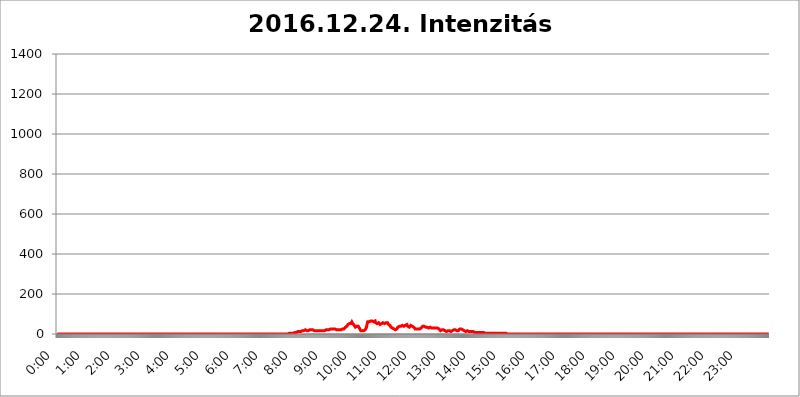
| Category | 2016.12.24. Intenzitás [W/m^2] |
|---|---|
| 0.0 | 0 |
| 0.0006944444444444445 | 0 |
| 0.001388888888888889 | 0 |
| 0.0020833333333333333 | 0 |
| 0.002777777777777778 | 0 |
| 0.003472222222222222 | 0 |
| 0.004166666666666667 | 0 |
| 0.004861111111111111 | 0 |
| 0.005555555555555556 | 0 |
| 0.0062499999999999995 | 0 |
| 0.006944444444444444 | 0 |
| 0.007638888888888889 | 0 |
| 0.008333333333333333 | 0 |
| 0.009027777777777779 | 0 |
| 0.009722222222222222 | 0 |
| 0.010416666666666666 | 0 |
| 0.011111111111111112 | 0 |
| 0.011805555555555555 | 0 |
| 0.012499999999999999 | 0 |
| 0.013194444444444444 | 0 |
| 0.013888888888888888 | 0 |
| 0.014583333333333332 | 0 |
| 0.015277777777777777 | 0 |
| 0.015972222222222224 | 0 |
| 0.016666666666666666 | 0 |
| 0.017361111111111112 | 0 |
| 0.018055555555555557 | 0 |
| 0.01875 | 0 |
| 0.019444444444444445 | 0 |
| 0.02013888888888889 | 0 |
| 0.020833333333333332 | 0 |
| 0.02152777777777778 | 0 |
| 0.022222222222222223 | 0 |
| 0.02291666666666667 | 0 |
| 0.02361111111111111 | 0 |
| 0.024305555555555556 | 0 |
| 0.024999999999999998 | 0 |
| 0.025694444444444447 | 0 |
| 0.02638888888888889 | 0 |
| 0.027083333333333334 | 0 |
| 0.027777777777777776 | 0 |
| 0.02847222222222222 | 0 |
| 0.029166666666666664 | 0 |
| 0.029861111111111113 | 0 |
| 0.030555555555555555 | 0 |
| 0.03125 | 0 |
| 0.03194444444444445 | 0 |
| 0.03263888888888889 | 0 |
| 0.03333333333333333 | 0 |
| 0.034027777777777775 | 0 |
| 0.034722222222222224 | 0 |
| 0.035416666666666666 | 0 |
| 0.036111111111111115 | 0 |
| 0.03680555555555556 | 0 |
| 0.0375 | 0 |
| 0.03819444444444444 | 0 |
| 0.03888888888888889 | 0 |
| 0.03958333333333333 | 0 |
| 0.04027777777777778 | 0 |
| 0.04097222222222222 | 0 |
| 0.041666666666666664 | 0 |
| 0.042361111111111106 | 0 |
| 0.04305555555555556 | 0 |
| 0.043750000000000004 | 0 |
| 0.044444444444444446 | 0 |
| 0.04513888888888889 | 0 |
| 0.04583333333333334 | 0 |
| 0.04652777777777778 | 0 |
| 0.04722222222222222 | 0 |
| 0.04791666666666666 | 0 |
| 0.04861111111111111 | 0 |
| 0.049305555555555554 | 0 |
| 0.049999999999999996 | 0 |
| 0.05069444444444445 | 0 |
| 0.051388888888888894 | 0 |
| 0.052083333333333336 | 0 |
| 0.05277777777777778 | 0 |
| 0.05347222222222222 | 0 |
| 0.05416666666666667 | 0 |
| 0.05486111111111111 | 0 |
| 0.05555555555555555 | 0 |
| 0.05625 | 0 |
| 0.05694444444444444 | 0 |
| 0.057638888888888885 | 0 |
| 0.05833333333333333 | 0 |
| 0.05902777777777778 | 0 |
| 0.059722222222222225 | 0 |
| 0.06041666666666667 | 0 |
| 0.061111111111111116 | 0 |
| 0.06180555555555556 | 0 |
| 0.0625 | 0 |
| 0.06319444444444444 | 0 |
| 0.06388888888888888 | 0 |
| 0.06458333333333334 | 0 |
| 0.06527777777777778 | 0 |
| 0.06597222222222222 | 0 |
| 0.06666666666666667 | 0 |
| 0.06736111111111111 | 0 |
| 0.06805555555555555 | 0 |
| 0.06874999999999999 | 0 |
| 0.06944444444444443 | 0 |
| 0.07013888888888889 | 0 |
| 0.07083333333333333 | 0 |
| 0.07152777777777779 | 0 |
| 0.07222222222222223 | 0 |
| 0.07291666666666667 | 0 |
| 0.07361111111111111 | 0 |
| 0.07430555555555556 | 0 |
| 0.075 | 0 |
| 0.07569444444444444 | 0 |
| 0.0763888888888889 | 0 |
| 0.07708333333333334 | 0 |
| 0.07777777777777778 | 0 |
| 0.07847222222222222 | 0 |
| 0.07916666666666666 | 0 |
| 0.0798611111111111 | 0 |
| 0.08055555555555556 | 0 |
| 0.08125 | 0 |
| 0.08194444444444444 | 0 |
| 0.08263888888888889 | 0 |
| 0.08333333333333333 | 0 |
| 0.08402777777777777 | 0 |
| 0.08472222222222221 | 0 |
| 0.08541666666666665 | 0 |
| 0.08611111111111112 | 0 |
| 0.08680555555555557 | 0 |
| 0.08750000000000001 | 0 |
| 0.08819444444444445 | 0 |
| 0.08888888888888889 | 0 |
| 0.08958333333333333 | 0 |
| 0.09027777777777778 | 0 |
| 0.09097222222222222 | 0 |
| 0.09166666666666667 | 0 |
| 0.09236111111111112 | 0 |
| 0.09305555555555556 | 0 |
| 0.09375 | 0 |
| 0.09444444444444444 | 0 |
| 0.09513888888888888 | 0 |
| 0.09583333333333333 | 0 |
| 0.09652777777777777 | 0 |
| 0.09722222222222222 | 0 |
| 0.09791666666666667 | 0 |
| 0.09861111111111111 | 0 |
| 0.09930555555555555 | 0 |
| 0.09999999999999999 | 0 |
| 0.10069444444444443 | 0 |
| 0.1013888888888889 | 0 |
| 0.10208333333333335 | 0 |
| 0.10277777777777779 | 0 |
| 0.10347222222222223 | 0 |
| 0.10416666666666667 | 0 |
| 0.10486111111111111 | 0 |
| 0.10555555555555556 | 0 |
| 0.10625 | 0 |
| 0.10694444444444444 | 0 |
| 0.1076388888888889 | 0 |
| 0.10833333333333334 | 0 |
| 0.10902777777777778 | 0 |
| 0.10972222222222222 | 0 |
| 0.1111111111111111 | 0 |
| 0.11180555555555556 | 0 |
| 0.11180555555555556 | 0 |
| 0.1125 | 0 |
| 0.11319444444444444 | 0 |
| 0.11388888888888889 | 0 |
| 0.11458333333333333 | 0 |
| 0.11527777777777777 | 0 |
| 0.11597222222222221 | 0 |
| 0.11666666666666665 | 0 |
| 0.1173611111111111 | 0 |
| 0.11805555555555557 | 0 |
| 0.11944444444444445 | 0 |
| 0.12013888888888889 | 0 |
| 0.12083333333333333 | 0 |
| 0.12152777777777778 | 0 |
| 0.12222222222222223 | 0 |
| 0.12291666666666667 | 0 |
| 0.12291666666666667 | 0 |
| 0.12361111111111112 | 0 |
| 0.12430555555555556 | 0 |
| 0.125 | 0 |
| 0.12569444444444444 | 0 |
| 0.12638888888888888 | 0 |
| 0.12708333333333333 | 0 |
| 0.16875 | 0 |
| 0.12847222222222224 | 0 |
| 0.12916666666666668 | 0 |
| 0.12986111111111112 | 0 |
| 0.13055555555555556 | 0 |
| 0.13125 | 0 |
| 0.13194444444444445 | 0 |
| 0.1326388888888889 | 0 |
| 0.13333333333333333 | 0 |
| 0.13402777777777777 | 0 |
| 0.13402777777777777 | 0 |
| 0.13472222222222222 | 0 |
| 0.13541666666666666 | 0 |
| 0.1361111111111111 | 0 |
| 0.13749999999999998 | 0 |
| 0.13819444444444443 | 0 |
| 0.1388888888888889 | 0 |
| 0.13958333333333334 | 0 |
| 0.14027777777777778 | 0 |
| 0.14097222222222222 | 0 |
| 0.14166666666666666 | 0 |
| 0.1423611111111111 | 0 |
| 0.14305555555555557 | 0 |
| 0.14375000000000002 | 0 |
| 0.14444444444444446 | 0 |
| 0.1451388888888889 | 0 |
| 0.1451388888888889 | 0 |
| 0.14652777777777778 | 0 |
| 0.14722222222222223 | 0 |
| 0.14791666666666667 | 0 |
| 0.1486111111111111 | 0 |
| 0.14930555555555555 | 0 |
| 0.15 | 0 |
| 0.15069444444444444 | 0 |
| 0.15138888888888888 | 0 |
| 0.15208333333333332 | 0 |
| 0.15277777777777776 | 0 |
| 0.15347222222222223 | 0 |
| 0.15416666666666667 | 0 |
| 0.15486111111111112 | 0 |
| 0.15555555555555556 | 0 |
| 0.15625 | 0 |
| 0.15694444444444444 | 0 |
| 0.15763888888888888 | 0 |
| 0.15833333333333333 | 0 |
| 0.15902777777777777 | 0 |
| 0.15972222222222224 | 0 |
| 0.16041666666666668 | 0 |
| 0.16111111111111112 | 0 |
| 0.16180555555555556 | 0 |
| 0.1625 | 0 |
| 0.16319444444444445 | 0 |
| 0.1638888888888889 | 0 |
| 0.16458333333333333 | 0 |
| 0.16527777777777777 | 0 |
| 0.16597222222222222 | 0 |
| 0.16666666666666666 | 0 |
| 0.1673611111111111 | 0 |
| 0.16805555555555554 | 0 |
| 0.16874999999999998 | 0 |
| 0.16944444444444443 | 0 |
| 0.17013888888888887 | 0 |
| 0.1708333333333333 | 0 |
| 0.17152777777777775 | 0 |
| 0.17222222222222225 | 0 |
| 0.1729166666666667 | 0 |
| 0.17361111111111113 | 0 |
| 0.17430555555555557 | 0 |
| 0.17500000000000002 | 0 |
| 0.17569444444444446 | 0 |
| 0.1763888888888889 | 0 |
| 0.17708333333333334 | 0 |
| 0.17777777777777778 | 0 |
| 0.17847222222222223 | 0 |
| 0.17916666666666667 | 0 |
| 0.1798611111111111 | 0 |
| 0.18055555555555555 | 0 |
| 0.18125 | 0 |
| 0.18194444444444444 | 0 |
| 0.1826388888888889 | 0 |
| 0.18333333333333335 | 0 |
| 0.1840277777777778 | 0 |
| 0.18472222222222223 | 0 |
| 0.18541666666666667 | 0 |
| 0.18611111111111112 | 0 |
| 0.18680555555555556 | 0 |
| 0.1875 | 0 |
| 0.18819444444444444 | 0 |
| 0.18888888888888888 | 0 |
| 0.18958333333333333 | 0 |
| 0.19027777777777777 | 0 |
| 0.1909722222222222 | 0 |
| 0.19166666666666665 | 0 |
| 0.19236111111111112 | 0 |
| 0.19305555555555554 | 0 |
| 0.19375 | 0 |
| 0.19444444444444445 | 0 |
| 0.1951388888888889 | 0 |
| 0.19583333333333333 | 0 |
| 0.19652777777777777 | 0 |
| 0.19722222222222222 | 0 |
| 0.19791666666666666 | 0 |
| 0.1986111111111111 | 0 |
| 0.19930555555555554 | 0 |
| 0.19999999999999998 | 0 |
| 0.20069444444444443 | 0 |
| 0.20138888888888887 | 0 |
| 0.2020833333333333 | 0 |
| 0.2027777777777778 | 0 |
| 0.2034722222222222 | 0 |
| 0.2041666666666667 | 0 |
| 0.20486111111111113 | 0 |
| 0.20555555555555557 | 0 |
| 0.20625000000000002 | 0 |
| 0.20694444444444446 | 0 |
| 0.2076388888888889 | 0 |
| 0.20833333333333334 | 0 |
| 0.20902777777777778 | 0 |
| 0.20972222222222223 | 0 |
| 0.21041666666666667 | 0 |
| 0.2111111111111111 | 0 |
| 0.21180555555555555 | 0 |
| 0.2125 | 0 |
| 0.21319444444444444 | 0 |
| 0.2138888888888889 | 0 |
| 0.21458333333333335 | 0 |
| 0.2152777777777778 | 0 |
| 0.21597222222222223 | 0 |
| 0.21666666666666667 | 0 |
| 0.21736111111111112 | 0 |
| 0.21805555555555556 | 0 |
| 0.21875 | 0 |
| 0.21944444444444444 | 0 |
| 0.22013888888888888 | 0 |
| 0.22083333333333333 | 0 |
| 0.22152777777777777 | 0 |
| 0.2222222222222222 | 0 |
| 0.22291666666666665 | 0 |
| 0.2236111111111111 | 0 |
| 0.22430555555555556 | 0 |
| 0.225 | 0 |
| 0.22569444444444445 | 0 |
| 0.2263888888888889 | 0 |
| 0.22708333333333333 | 0 |
| 0.22777777777777777 | 0 |
| 0.22847222222222222 | 0 |
| 0.22916666666666666 | 0 |
| 0.2298611111111111 | 0 |
| 0.23055555555555554 | 0 |
| 0.23124999999999998 | 0 |
| 0.23194444444444443 | 0 |
| 0.23263888888888887 | 0 |
| 0.2333333333333333 | 0 |
| 0.2340277777777778 | 0 |
| 0.2347222222222222 | 0 |
| 0.2354166666666667 | 0 |
| 0.23611111111111113 | 0 |
| 0.23680555555555557 | 0 |
| 0.23750000000000002 | 0 |
| 0.23819444444444446 | 0 |
| 0.2388888888888889 | 0 |
| 0.23958333333333334 | 0 |
| 0.24027777777777778 | 0 |
| 0.24097222222222223 | 0 |
| 0.24166666666666667 | 0 |
| 0.2423611111111111 | 0 |
| 0.24305555555555555 | 0 |
| 0.24375 | 0 |
| 0.24444444444444446 | 0 |
| 0.24513888888888888 | 0 |
| 0.24583333333333335 | 0 |
| 0.2465277777777778 | 0 |
| 0.24722222222222223 | 0 |
| 0.24791666666666667 | 0 |
| 0.24861111111111112 | 0 |
| 0.24930555555555556 | 0 |
| 0.25 | 0 |
| 0.25069444444444444 | 0 |
| 0.2513888888888889 | 0 |
| 0.2520833333333333 | 0 |
| 0.25277777777777777 | 0 |
| 0.2534722222222222 | 0 |
| 0.25416666666666665 | 0 |
| 0.2548611111111111 | 0 |
| 0.2555555555555556 | 0 |
| 0.25625000000000003 | 0 |
| 0.2569444444444445 | 0 |
| 0.2576388888888889 | 0 |
| 0.25833333333333336 | 0 |
| 0.2590277777777778 | 0 |
| 0.25972222222222224 | 0 |
| 0.2604166666666667 | 0 |
| 0.2611111111111111 | 0 |
| 0.26180555555555557 | 0 |
| 0.2625 | 0 |
| 0.26319444444444445 | 0 |
| 0.2638888888888889 | 0 |
| 0.26458333333333334 | 0 |
| 0.2652777777777778 | 0 |
| 0.2659722222222222 | 0 |
| 0.26666666666666666 | 0 |
| 0.2673611111111111 | 0 |
| 0.26805555555555555 | 0 |
| 0.26875 | 0 |
| 0.26944444444444443 | 0 |
| 0.2701388888888889 | 0 |
| 0.2708333333333333 | 0 |
| 0.27152777777777776 | 0 |
| 0.2722222222222222 | 0 |
| 0.27291666666666664 | 0 |
| 0.2736111111111111 | 0 |
| 0.2743055555555555 | 0 |
| 0.27499999999999997 | 0 |
| 0.27569444444444446 | 0 |
| 0.27638888888888885 | 0 |
| 0.27708333333333335 | 0 |
| 0.2777777777777778 | 0 |
| 0.27847222222222223 | 0 |
| 0.2791666666666667 | 0 |
| 0.2798611111111111 | 0 |
| 0.28055555555555556 | 0 |
| 0.28125 | 0 |
| 0.28194444444444444 | 0 |
| 0.2826388888888889 | 0 |
| 0.2833333333333333 | 0 |
| 0.28402777777777777 | 0 |
| 0.2847222222222222 | 0 |
| 0.28541666666666665 | 0 |
| 0.28611111111111115 | 0 |
| 0.28680555555555554 | 0 |
| 0.28750000000000003 | 0 |
| 0.2881944444444445 | 0 |
| 0.2888888888888889 | 0 |
| 0.28958333333333336 | 0 |
| 0.2902777777777778 | 0 |
| 0.29097222222222224 | 0 |
| 0.2916666666666667 | 0 |
| 0.2923611111111111 | 0 |
| 0.29305555555555557 | 0 |
| 0.29375 | 0 |
| 0.29444444444444445 | 0 |
| 0.2951388888888889 | 0 |
| 0.29583333333333334 | 0 |
| 0.2965277777777778 | 0 |
| 0.2972222222222222 | 0 |
| 0.29791666666666666 | 0 |
| 0.2986111111111111 | 0 |
| 0.29930555555555555 | 0 |
| 0.3 | 0 |
| 0.30069444444444443 | 0 |
| 0.3013888888888889 | 0 |
| 0.3020833333333333 | 0 |
| 0.30277777777777776 | 0 |
| 0.3034722222222222 | 0 |
| 0.30416666666666664 | 0 |
| 0.3048611111111111 | 0 |
| 0.3055555555555555 | 0 |
| 0.30624999999999997 | 0 |
| 0.3069444444444444 | 0 |
| 0.3076388888888889 | 0 |
| 0.30833333333333335 | 0 |
| 0.3090277777777778 | 0 |
| 0.30972222222222223 | 0 |
| 0.3104166666666667 | 0 |
| 0.3111111111111111 | 0 |
| 0.31180555555555556 | 0 |
| 0.3125 | 0 |
| 0.31319444444444444 | 0 |
| 0.3138888888888889 | 0 |
| 0.3145833333333333 | 0 |
| 0.31527777777777777 | 0 |
| 0.3159722222222222 | 0 |
| 0.31666666666666665 | 0 |
| 0.31736111111111115 | 0 |
| 0.31805555555555554 | 0 |
| 0.31875000000000003 | 0 |
| 0.3194444444444445 | 0 |
| 0.3201388888888889 | 0 |
| 0.32083333333333336 | 0 |
| 0.3215277777777778 | 0 |
| 0.32222222222222224 | 0 |
| 0.3229166666666667 | 0 |
| 0.3236111111111111 | 0 |
| 0.32430555555555557 | 0 |
| 0.325 | 3.525 |
| 0.32569444444444445 | 3.525 |
| 0.3263888888888889 | 3.525 |
| 0.32708333333333334 | 3.525 |
| 0.3277777777777778 | 3.525 |
| 0.3284722222222222 | 3.525 |
| 0.32916666666666666 | 3.525 |
| 0.3298611111111111 | 3.525 |
| 0.33055555555555555 | 3.525 |
| 0.33125 | 3.525 |
| 0.33194444444444443 | 3.525 |
| 0.3326388888888889 | 3.525 |
| 0.3333333333333333 | 7.887 |
| 0.3340277777777778 | 7.887 |
| 0.3347222222222222 | 7.887 |
| 0.3354166666666667 | 7.887 |
| 0.3361111111111111 | 7.887 |
| 0.3368055555555556 | 12.257 |
| 0.33749999999999997 | 12.257 |
| 0.33819444444444446 | 12.257 |
| 0.33888888888888885 | 12.257 |
| 0.33958333333333335 | 12.257 |
| 0.34027777777777773 | 12.257 |
| 0.34097222222222223 | 12.257 |
| 0.3416666666666666 | 12.257 |
| 0.3423611111111111 | 12.257 |
| 0.3430555555555555 | 16.636 |
| 0.34375 | 16.636 |
| 0.3444444444444445 | 16.636 |
| 0.3451388888888889 | 16.636 |
| 0.3458333333333334 | 16.636 |
| 0.34652777777777777 | 21.024 |
| 0.34722222222222227 | 21.024 |
| 0.34791666666666665 | 21.024 |
| 0.34861111111111115 | 16.636 |
| 0.34930555555555554 | 16.636 |
| 0.35000000000000003 | 16.636 |
| 0.3506944444444444 | 16.636 |
| 0.3513888888888889 | 16.636 |
| 0.3520833333333333 | 16.636 |
| 0.3527777777777778 | 16.636 |
| 0.3534722222222222 | 21.024 |
| 0.3541666666666667 | 21.024 |
| 0.3548611111111111 | 21.024 |
| 0.35555555555555557 | 21.024 |
| 0.35625 | 21.024 |
| 0.35694444444444445 | 21.024 |
| 0.3576388888888889 | 21.024 |
| 0.35833333333333334 | 21.024 |
| 0.3590277777777778 | 16.636 |
| 0.3597222222222222 | 16.636 |
| 0.36041666666666666 | 16.636 |
| 0.3611111111111111 | 16.636 |
| 0.36180555555555555 | 16.636 |
| 0.3625 | 16.636 |
| 0.36319444444444443 | 16.636 |
| 0.3638888888888889 | 16.636 |
| 0.3645833333333333 | 16.636 |
| 0.3652777777777778 | 16.636 |
| 0.3659722222222222 | 16.636 |
| 0.3666666666666667 | 16.636 |
| 0.3673611111111111 | 16.636 |
| 0.3680555555555556 | 16.636 |
| 0.36874999999999997 | 16.636 |
| 0.36944444444444446 | 16.636 |
| 0.37013888888888885 | 16.636 |
| 0.37083333333333335 | 16.636 |
| 0.37152777777777773 | 21.024 |
| 0.37222222222222223 | 16.636 |
| 0.3729166666666666 | 16.636 |
| 0.3736111111111111 | 16.636 |
| 0.3743055555555555 | 16.636 |
| 0.375 | 16.636 |
| 0.3756944444444445 | 16.636 |
| 0.3763888888888889 | 16.636 |
| 0.3770833333333334 | 21.024 |
| 0.37777777777777777 | 21.024 |
| 0.37847222222222227 | 21.024 |
| 0.37916666666666665 | 21.024 |
| 0.37986111111111115 | 21.024 |
| 0.38055555555555554 | 21.024 |
| 0.38125000000000003 | 21.024 |
| 0.3819444444444444 | 21.024 |
| 0.3826388888888889 | 25.419 |
| 0.3833333333333333 | 25.419 |
| 0.3840277777777778 | 25.419 |
| 0.3847222222222222 | 25.419 |
| 0.3854166666666667 | 25.419 |
| 0.3861111111111111 | 25.419 |
| 0.38680555555555557 | 25.419 |
| 0.3875 | 25.419 |
| 0.38819444444444445 | 29.823 |
| 0.3888888888888889 | 25.419 |
| 0.38958333333333334 | 25.419 |
| 0.3902777777777778 | 25.419 |
| 0.3909722222222222 | 21.024 |
| 0.39166666666666666 | 21.024 |
| 0.3923611111111111 | 21.024 |
| 0.39305555555555555 | 21.024 |
| 0.39375 | 21.024 |
| 0.39444444444444443 | 21.024 |
| 0.3951388888888889 | 25.419 |
| 0.3958333333333333 | 21.024 |
| 0.3965277777777778 | 21.024 |
| 0.3972222222222222 | 21.024 |
| 0.3979166666666667 | 21.024 |
| 0.3986111111111111 | 25.419 |
| 0.3993055555555556 | 25.419 |
| 0.39999999999999997 | 25.419 |
| 0.40069444444444446 | 25.419 |
| 0.40138888888888885 | 25.419 |
| 0.40208333333333335 | 25.419 |
| 0.40277777777777773 | 29.823 |
| 0.40347222222222223 | 29.823 |
| 0.4041666666666666 | 34.234 |
| 0.4048611111111111 | 34.234 |
| 0.4055555555555555 | 34.234 |
| 0.40625 | 38.653 |
| 0.4069444444444445 | 43.079 |
| 0.4076388888888889 | 47.511 |
| 0.4083333333333334 | 47.511 |
| 0.40902777777777777 | 47.511 |
| 0.40972222222222227 | 51.951 |
| 0.41041666666666665 | 51.951 |
| 0.41111111111111115 | 47.511 |
| 0.41180555555555554 | 51.951 |
| 0.41250000000000003 | 56.398 |
| 0.4131944444444444 | 60.85 |
| 0.4138888888888889 | 56.398 |
| 0.4145833333333333 | 51.951 |
| 0.4152777777777778 | 51.951 |
| 0.4159722222222222 | 51.951 |
| 0.4166666666666667 | 43.079 |
| 0.4173611111111111 | 38.653 |
| 0.41805555555555557 | 34.234 |
| 0.41875 | 34.234 |
| 0.41944444444444445 | 34.234 |
| 0.4201388888888889 | 38.653 |
| 0.42083333333333334 | 38.653 |
| 0.4215277777777778 | 34.234 |
| 0.4222222222222222 | 38.653 |
| 0.42291666666666666 | 38.653 |
| 0.4236111111111111 | 34.234 |
| 0.42430555555555555 | 25.419 |
| 0.425 | 21.024 |
| 0.42569444444444443 | 16.636 |
| 0.4263888888888889 | 12.257 |
| 0.4270833333333333 | 12.257 |
| 0.4277777777777778 | 16.636 |
| 0.4284722222222222 | 21.024 |
| 0.4291666666666667 | 21.024 |
| 0.4298611111111111 | 16.636 |
| 0.4305555555555556 | 16.636 |
| 0.43124999999999997 | 21.024 |
| 0.43194444444444446 | 21.024 |
| 0.43263888888888885 | 21.024 |
| 0.43333333333333335 | 29.823 |
| 0.43402777777777773 | 38.653 |
| 0.43472222222222223 | 51.951 |
| 0.4354166666666666 | 60.85 |
| 0.4361111111111111 | 65.31 |
| 0.4368055555555555 | 60.85 |
| 0.4375 | 60.85 |
| 0.4381944444444445 | 65.31 |
| 0.4388888888888889 | 65.31 |
| 0.4395833333333334 | 65.31 |
| 0.44027777777777777 | 65.31 |
| 0.44097222222222227 | 65.31 |
| 0.44166666666666665 | 65.31 |
| 0.44236111111111115 | 69.775 |
| 0.44305555555555554 | 65.31 |
| 0.44375000000000003 | 60.85 |
| 0.4444444444444444 | 60.85 |
| 0.4451388888888889 | 60.85 |
| 0.4458333333333333 | 65.31 |
| 0.4465277777777778 | 56.398 |
| 0.4472222222222222 | 56.398 |
| 0.4479166666666667 | 51.951 |
| 0.4486111111111111 | 51.951 |
| 0.44930555555555557 | 51.951 |
| 0.45 | 56.398 |
| 0.45069444444444445 | 56.398 |
| 0.4513888888888889 | 56.398 |
| 0.45208333333333334 | 51.951 |
| 0.4527777777777778 | 47.511 |
| 0.4534722222222222 | 47.511 |
| 0.45416666666666666 | 47.511 |
| 0.4548611111111111 | 51.951 |
| 0.45555555555555555 | 56.398 |
| 0.45625 | 56.398 |
| 0.45694444444444443 | 56.398 |
| 0.4576388888888889 | 51.951 |
| 0.4583333333333333 | 51.951 |
| 0.4590277777777778 | 51.951 |
| 0.4597222222222222 | 51.951 |
| 0.4604166666666667 | 51.951 |
| 0.4611111111111111 | 56.398 |
| 0.4618055555555556 | 56.398 |
| 0.46249999999999997 | 60.85 |
| 0.46319444444444446 | 56.398 |
| 0.46388888888888885 | 51.951 |
| 0.46458333333333335 | 47.511 |
| 0.46527777777777773 | 47.511 |
| 0.46597222222222223 | 43.079 |
| 0.4666666666666666 | 43.079 |
| 0.4673611111111111 | 38.653 |
| 0.4680555555555555 | 34.234 |
| 0.46875 | 34.234 |
| 0.4694444444444445 | 29.823 |
| 0.4701388888888889 | 29.823 |
| 0.4708333333333334 | 25.419 |
| 0.47152777777777777 | 25.419 |
| 0.47222222222222227 | 25.419 |
| 0.47291666666666665 | 25.419 |
| 0.47361111111111115 | 21.024 |
| 0.47430555555555554 | 21.024 |
| 0.47500000000000003 | 21.024 |
| 0.4756944444444444 | 25.419 |
| 0.4763888888888889 | 25.419 |
| 0.4770833333333333 | 29.823 |
| 0.4777777777777778 | 34.234 |
| 0.4784722222222222 | 34.234 |
| 0.4791666666666667 | 34.234 |
| 0.4798611111111111 | 38.653 |
| 0.48055555555555557 | 38.653 |
| 0.48125 | 38.653 |
| 0.48194444444444445 | 38.653 |
| 0.4826388888888889 | 38.653 |
| 0.48333333333333334 | 38.653 |
| 0.4840277777777778 | 43.079 |
| 0.4847222222222222 | 38.653 |
| 0.48541666666666666 | 38.653 |
| 0.4861111111111111 | 38.653 |
| 0.48680555555555555 | 38.653 |
| 0.4875 | 38.653 |
| 0.48819444444444443 | 43.079 |
| 0.4888888888888889 | 43.079 |
| 0.4895833333333333 | 47.511 |
| 0.4902777777777778 | 47.511 |
| 0.4909722222222222 | 43.079 |
| 0.4916666666666667 | 38.653 |
| 0.4923611111111111 | 38.653 |
| 0.4930555555555556 | 38.653 |
| 0.49374999999999997 | 34.234 |
| 0.49444444444444446 | 34.234 |
| 0.49513888888888885 | 38.653 |
| 0.49583333333333335 | 43.079 |
| 0.49652777777777773 | 47.511 |
| 0.49722222222222223 | 43.079 |
| 0.4979166666666666 | 38.653 |
| 0.4986111111111111 | 38.653 |
| 0.4993055555555555 | 34.234 |
| 0.5 | 34.234 |
| 0.5006944444444444 | 29.823 |
| 0.5013888888888889 | 29.823 |
| 0.5020833333333333 | 25.419 |
| 0.5027777777777778 | 25.419 |
| 0.5034722222222222 | 25.419 |
| 0.5041666666666667 | 25.419 |
| 0.5048611111111111 | 25.419 |
| 0.5055555555555555 | 25.419 |
| 0.50625 | 25.419 |
| 0.5069444444444444 | 25.419 |
| 0.5076388888888889 | 25.419 |
| 0.5083333333333333 | 25.419 |
| 0.5090277777777777 | 29.823 |
| 0.5097222222222222 | 29.823 |
| 0.5104166666666666 | 29.823 |
| 0.5111111111111112 | 34.234 |
| 0.5118055555555555 | 34.234 |
| 0.5125000000000001 | 38.653 |
| 0.5131944444444444 | 38.653 |
| 0.513888888888889 | 38.653 |
| 0.5145833333333333 | 38.653 |
| 0.5152777777777778 | 34.234 |
| 0.5159722222222222 | 34.234 |
| 0.5166666666666667 | 34.234 |
| 0.517361111111111 | 34.234 |
| 0.5180555555555556 | 34.234 |
| 0.5187499999999999 | 34.234 |
| 0.5194444444444445 | 29.823 |
| 0.5201388888888888 | 29.823 |
| 0.5208333333333334 | 29.823 |
| 0.5215277777777778 | 34.234 |
| 0.5222222222222223 | 34.234 |
| 0.5229166666666667 | 34.234 |
| 0.5236111111111111 | 34.234 |
| 0.5243055555555556 | 29.823 |
| 0.525 | 29.823 |
| 0.5256944444444445 | 29.823 |
| 0.5263888888888889 | 29.823 |
| 0.5270833333333333 | 29.823 |
| 0.5277777777777778 | 29.823 |
| 0.5284722222222222 | 29.823 |
| 0.5291666666666667 | 29.823 |
| 0.5298611111111111 | 29.823 |
| 0.5305555555555556 | 29.823 |
| 0.53125 | 29.823 |
| 0.5319444444444444 | 29.823 |
| 0.5326388888888889 | 29.823 |
| 0.5333333333333333 | 29.823 |
| 0.5340277777777778 | 25.419 |
| 0.5347222222222222 | 25.419 |
| 0.5354166666666667 | 25.419 |
| 0.5361111111111111 | 21.024 |
| 0.5368055555555555 | 21.024 |
| 0.5375 | 16.636 |
| 0.5381944444444444 | 16.636 |
| 0.5388888888888889 | 16.636 |
| 0.5395833333333333 | 21.024 |
| 0.5402777777777777 | 21.024 |
| 0.5409722222222222 | 21.024 |
| 0.5416666666666666 | 21.024 |
| 0.5423611111111112 | 21.024 |
| 0.5430555555555555 | 21.024 |
| 0.5437500000000001 | 16.636 |
| 0.5444444444444444 | 16.636 |
| 0.545138888888889 | 16.636 |
| 0.5458333333333333 | 12.257 |
| 0.5465277777777778 | 16.636 |
| 0.5472222222222222 | 16.636 |
| 0.5479166666666667 | 16.636 |
| 0.548611111111111 | 16.636 |
| 0.5493055555555556 | 16.636 |
| 0.5499999999999999 | 16.636 |
| 0.5506944444444445 | 16.636 |
| 0.5513888888888888 | 16.636 |
| 0.5520833333333334 | 12.257 |
| 0.5527777777777778 | 16.636 |
| 0.5534722222222223 | 16.636 |
| 0.5541666666666667 | 16.636 |
| 0.5548611111111111 | 16.636 |
| 0.5555555555555556 | 16.636 |
| 0.55625 | 21.024 |
| 0.5569444444444445 | 21.024 |
| 0.5576388888888889 | 21.024 |
| 0.5583333333333333 | 21.024 |
| 0.5590277777777778 | 21.024 |
| 0.5597222222222222 | 16.636 |
| 0.5604166666666667 | 16.636 |
| 0.5611111111111111 | 16.636 |
| 0.5618055555555556 | 16.636 |
| 0.5625 | 16.636 |
| 0.5631944444444444 | 21.024 |
| 0.5638888888888889 | 21.024 |
| 0.5645833333333333 | 25.419 |
| 0.5652777777777778 | 25.419 |
| 0.5659722222222222 | 25.419 |
| 0.5666666666666667 | 25.419 |
| 0.5673611111111111 | 21.024 |
| 0.5680555555555555 | 25.419 |
| 0.56875 | 21.024 |
| 0.5694444444444444 | 21.024 |
| 0.5701388888888889 | 21.024 |
| 0.5708333333333333 | 16.636 |
| 0.5715277777777777 | 12.257 |
| 0.5722222222222222 | 12.257 |
| 0.5729166666666666 | 12.257 |
| 0.5736111111111112 | 12.257 |
| 0.5743055555555555 | 12.257 |
| 0.5750000000000001 | 16.636 |
| 0.5756944444444444 | 12.257 |
| 0.576388888888889 | 12.257 |
| 0.5770833333333333 | 12.257 |
| 0.5777777777777778 | 12.257 |
| 0.5784722222222222 | 12.257 |
| 0.5791666666666667 | 12.257 |
| 0.579861111111111 | 12.257 |
| 0.5805555555555556 | 12.257 |
| 0.5812499999999999 | 12.257 |
| 0.5819444444444445 | 12.257 |
| 0.5826388888888888 | 12.257 |
| 0.5833333333333334 | 12.257 |
| 0.5840277777777778 | 7.887 |
| 0.5847222222222223 | 7.887 |
| 0.5854166666666667 | 7.887 |
| 0.5861111111111111 | 7.887 |
| 0.5868055555555556 | 7.887 |
| 0.5875 | 7.887 |
| 0.5881944444444445 | 12.257 |
| 0.5888888888888889 | 12.257 |
| 0.5895833333333333 | 7.887 |
| 0.5902777777777778 | 7.887 |
| 0.5909722222222222 | 7.887 |
| 0.5916666666666667 | 7.887 |
| 0.5923611111111111 | 7.887 |
| 0.5930555555555556 | 7.887 |
| 0.59375 | 7.887 |
| 0.5944444444444444 | 7.887 |
| 0.5951388888888889 | 7.887 |
| 0.5958333333333333 | 7.887 |
| 0.5965277777777778 | 3.525 |
| 0.5972222222222222 | 3.525 |
| 0.5979166666666667 | 7.887 |
| 0.5986111111111111 | 7.887 |
| 0.5993055555555555 | 3.525 |
| 0.6 | 3.525 |
| 0.6006944444444444 | 3.525 |
| 0.6013888888888889 | 3.525 |
| 0.6020833333333333 | 3.525 |
| 0.6027777777777777 | 3.525 |
| 0.6034722222222222 | 7.887 |
| 0.6041666666666666 | 3.525 |
| 0.6048611111111112 | 3.525 |
| 0.6055555555555555 | 3.525 |
| 0.6062500000000001 | 3.525 |
| 0.6069444444444444 | 3.525 |
| 0.607638888888889 | 3.525 |
| 0.6083333333333333 | 3.525 |
| 0.6090277777777778 | 3.525 |
| 0.6097222222222222 | 3.525 |
| 0.6104166666666667 | 3.525 |
| 0.611111111111111 | 3.525 |
| 0.6118055555555556 | 3.525 |
| 0.6124999999999999 | 3.525 |
| 0.6131944444444445 | 3.525 |
| 0.6138888888888888 | 3.525 |
| 0.6145833333333334 | 3.525 |
| 0.6152777777777778 | 3.525 |
| 0.6159722222222223 | 3.525 |
| 0.6166666666666667 | 3.525 |
| 0.6173611111111111 | 3.525 |
| 0.6180555555555556 | 3.525 |
| 0.61875 | 3.525 |
| 0.6194444444444445 | 3.525 |
| 0.6201388888888889 | 3.525 |
| 0.6208333333333333 | 3.525 |
| 0.6215277777777778 | 3.525 |
| 0.6222222222222222 | 3.525 |
| 0.6229166666666667 | 3.525 |
| 0.6236111111111111 | 3.525 |
| 0.6243055555555556 | 3.525 |
| 0.625 | 3.525 |
| 0.6256944444444444 | 3.525 |
| 0.6263888888888889 | 3.525 |
| 0.6270833333333333 | 3.525 |
| 0.6277777777777778 | 3.525 |
| 0.6284722222222222 | 3.525 |
| 0.6291666666666667 | 3.525 |
| 0.6298611111111111 | 0 |
| 0.6305555555555555 | 3.525 |
| 0.63125 | 0 |
| 0.6319444444444444 | 0 |
| 0.6326388888888889 | 3.525 |
| 0.6333333333333333 | 0 |
| 0.6340277777777777 | 0 |
| 0.6347222222222222 | 0 |
| 0.6354166666666666 | 0 |
| 0.6361111111111112 | 0 |
| 0.6368055555555555 | 0 |
| 0.6375000000000001 | 0 |
| 0.6381944444444444 | 0 |
| 0.638888888888889 | 0 |
| 0.6395833333333333 | 0 |
| 0.6402777777777778 | 0 |
| 0.6409722222222222 | 0 |
| 0.6416666666666667 | 0 |
| 0.642361111111111 | 0 |
| 0.6430555555555556 | 0 |
| 0.6437499999999999 | 0 |
| 0.6444444444444445 | 0 |
| 0.6451388888888888 | 0 |
| 0.6458333333333334 | 0 |
| 0.6465277777777778 | 0 |
| 0.6472222222222223 | 0 |
| 0.6479166666666667 | 0 |
| 0.6486111111111111 | 0 |
| 0.6493055555555556 | 0 |
| 0.65 | 0 |
| 0.6506944444444445 | 0 |
| 0.6513888888888889 | 0 |
| 0.6520833333333333 | 0 |
| 0.6527777777777778 | 0 |
| 0.6534722222222222 | 0 |
| 0.6541666666666667 | 0 |
| 0.6548611111111111 | 0 |
| 0.6555555555555556 | 0 |
| 0.65625 | 0 |
| 0.6569444444444444 | 0 |
| 0.6576388888888889 | 0 |
| 0.6583333333333333 | 0 |
| 0.6590277777777778 | 0 |
| 0.6597222222222222 | 0 |
| 0.6604166666666667 | 0 |
| 0.6611111111111111 | 0 |
| 0.6618055555555555 | 0 |
| 0.6625 | 0 |
| 0.6631944444444444 | 0 |
| 0.6638888888888889 | 0 |
| 0.6645833333333333 | 0 |
| 0.6652777777777777 | 0 |
| 0.6659722222222222 | 0 |
| 0.6666666666666666 | 0 |
| 0.6673611111111111 | 0 |
| 0.6680555555555556 | 0 |
| 0.6687500000000001 | 0 |
| 0.6694444444444444 | 0 |
| 0.6701388888888888 | 0 |
| 0.6708333333333334 | 0 |
| 0.6715277777777778 | 0 |
| 0.6722222222222222 | 0 |
| 0.6729166666666666 | 0 |
| 0.6736111111111112 | 0 |
| 0.6743055555555556 | 0 |
| 0.6749999999999999 | 0 |
| 0.6756944444444444 | 0 |
| 0.6763888888888889 | 0 |
| 0.6770833333333334 | 0 |
| 0.6777777777777777 | 0 |
| 0.6784722222222223 | 0 |
| 0.6791666666666667 | 0 |
| 0.6798611111111111 | 0 |
| 0.6805555555555555 | 0 |
| 0.68125 | 0 |
| 0.6819444444444445 | 0 |
| 0.6826388888888889 | 0 |
| 0.6833333333333332 | 0 |
| 0.6840277777777778 | 0 |
| 0.6847222222222222 | 0 |
| 0.6854166666666667 | 0 |
| 0.686111111111111 | 0 |
| 0.6868055555555556 | 0 |
| 0.6875 | 0 |
| 0.6881944444444444 | 0 |
| 0.688888888888889 | 0 |
| 0.6895833333333333 | 0 |
| 0.6902777777777778 | 0 |
| 0.6909722222222222 | 0 |
| 0.6916666666666668 | 0 |
| 0.6923611111111111 | 0 |
| 0.6930555555555555 | 0 |
| 0.69375 | 0 |
| 0.6944444444444445 | 0 |
| 0.6951388888888889 | 0 |
| 0.6958333333333333 | 0 |
| 0.6965277777777777 | 0 |
| 0.6972222222222223 | 0 |
| 0.6979166666666666 | 0 |
| 0.6986111111111111 | 0 |
| 0.6993055555555556 | 0 |
| 0.7000000000000001 | 0 |
| 0.7006944444444444 | 0 |
| 0.7013888888888888 | 0 |
| 0.7020833333333334 | 0 |
| 0.7027777777777778 | 0 |
| 0.7034722222222222 | 0 |
| 0.7041666666666666 | 0 |
| 0.7048611111111112 | 0 |
| 0.7055555555555556 | 0 |
| 0.7062499999999999 | 0 |
| 0.7069444444444444 | 0 |
| 0.7076388888888889 | 0 |
| 0.7083333333333334 | 0 |
| 0.7090277777777777 | 0 |
| 0.7097222222222223 | 0 |
| 0.7104166666666667 | 0 |
| 0.7111111111111111 | 0 |
| 0.7118055555555555 | 0 |
| 0.7125 | 0 |
| 0.7131944444444445 | 0 |
| 0.7138888888888889 | 0 |
| 0.7145833333333332 | 0 |
| 0.7152777777777778 | 0 |
| 0.7159722222222222 | 0 |
| 0.7166666666666667 | 0 |
| 0.717361111111111 | 0 |
| 0.7180555555555556 | 0 |
| 0.71875 | 0 |
| 0.7194444444444444 | 0 |
| 0.720138888888889 | 0 |
| 0.7208333333333333 | 0 |
| 0.7215277777777778 | 0 |
| 0.7222222222222222 | 0 |
| 0.7229166666666668 | 0 |
| 0.7236111111111111 | 0 |
| 0.7243055555555555 | 0 |
| 0.725 | 0 |
| 0.7256944444444445 | 0 |
| 0.7263888888888889 | 0 |
| 0.7270833333333333 | 0 |
| 0.7277777777777777 | 0 |
| 0.7284722222222223 | 0 |
| 0.7291666666666666 | 0 |
| 0.7298611111111111 | 0 |
| 0.7305555555555556 | 0 |
| 0.7312500000000001 | 0 |
| 0.7319444444444444 | 0 |
| 0.7326388888888888 | 0 |
| 0.7333333333333334 | 0 |
| 0.7340277777777778 | 0 |
| 0.7347222222222222 | 0 |
| 0.7354166666666666 | 0 |
| 0.7361111111111112 | 0 |
| 0.7368055555555556 | 0 |
| 0.7374999999999999 | 0 |
| 0.7381944444444444 | 0 |
| 0.7388888888888889 | 0 |
| 0.7395833333333334 | 0 |
| 0.7402777777777777 | 0 |
| 0.7409722222222223 | 0 |
| 0.7416666666666667 | 0 |
| 0.7423611111111111 | 0 |
| 0.7430555555555555 | 0 |
| 0.74375 | 0 |
| 0.7444444444444445 | 0 |
| 0.7451388888888889 | 0 |
| 0.7458333333333332 | 0 |
| 0.7465277777777778 | 0 |
| 0.7472222222222222 | 0 |
| 0.7479166666666667 | 0 |
| 0.748611111111111 | 0 |
| 0.7493055555555556 | 0 |
| 0.75 | 0 |
| 0.7506944444444444 | 0 |
| 0.751388888888889 | 0 |
| 0.7520833333333333 | 0 |
| 0.7527777777777778 | 0 |
| 0.7534722222222222 | 0 |
| 0.7541666666666668 | 0 |
| 0.7548611111111111 | 0 |
| 0.7555555555555555 | 0 |
| 0.75625 | 0 |
| 0.7569444444444445 | 0 |
| 0.7576388888888889 | 0 |
| 0.7583333333333333 | 0 |
| 0.7590277777777777 | 0 |
| 0.7597222222222223 | 0 |
| 0.7604166666666666 | 0 |
| 0.7611111111111111 | 0 |
| 0.7618055555555556 | 0 |
| 0.7625000000000001 | 0 |
| 0.7631944444444444 | 0 |
| 0.7638888888888888 | 0 |
| 0.7645833333333334 | 0 |
| 0.7652777777777778 | 0 |
| 0.7659722222222222 | 0 |
| 0.7666666666666666 | 0 |
| 0.7673611111111112 | 0 |
| 0.7680555555555556 | 0 |
| 0.7687499999999999 | 0 |
| 0.7694444444444444 | 0 |
| 0.7701388888888889 | 0 |
| 0.7708333333333334 | 0 |
| 0.7715277777777777 | 0 |
| 0.7722222222222223 | 0 |
| 0.7729166666666667 | 0 |
| 0.7736111111111111 | 0 |
| 0.7743055555555555 | 0 |
| 0.775 | 0 |
| 0.7756944444444445 | 0 |
| 0.7763888888888889 | 0 |
| 0.7770833333333332 | 0 |
| 0.7777777777777778 | 0 |
| 0.7784722222222222 | 0 |
| 0.7791666666666667 | 0 |
| 0.779861111111111 | 0 |
| 0.7805555555555556 | 0 |
| 0.78125 | 0 |
| 0.7819444444444444 | 0 |
| 0.782638888888889 | 0 |
| 0.7833333333333333 | 0 |
| 0.7840277777777778 | 0 |
| 0.7847222222222222 | 0 |
| 0.7854166666666668 | 0 |
| 0.7861111111111111 | 0 |
| 0.7868055555555555 | 0 |
| 0.7875 | 0 |
| 0.7881944444444445 | 0 |
| 0.7888888888888889 | 0 |
| 0.7895833333333333 | 0 |
| 0.7902777777777777 | 0 |
| 0.7909722222222223 | 0 |
| 0.7916666666666666 | 0 |
| 0.7923611111111111 | 0 |
| 0.7930555555555556 | 0 |
| 0.7937500000000001 | 0 |
| 0.7944444444444444 | 0 |
| 0.7951388888888888 | 0 |
| 0.7958333333333334 | 0 |
| 0.7965277777777778 | 0 |
| 0.7972222222222222 | 0 |
| 0.7979166666666666 | 0 |
| 0.7986111111111112 | 0 |
| 0.7993055555555556 | 0 |
| 0.7999999999999999 | 0 |
| 0.8006944444444444 | 0 |
| 0.8013888888888889 | 0 |
| 0.8020833333333334 | 0 |
| 0.8027777777777777 | 0 |
| 0.8034722222222223 | 0 |
| 0.8041666666666667 | 0 |
| 0.8048611111111111 | 0 |
| 0.8055555555555555 | 0 |
| 0.80625 | 0 |
| 0.8069444444444445 | 0 |
| 0.8076388888888889 | 0 |
| 0.8083333333333332 | 0 |
| 0.8090277777777778 | 0 |
| 0.8097222222222222 | 0 |
| 0.8104166666666667 | 0 |
| 0.811111111111111 | 0 |
| 0.8118055555555556 | 0 |
| 0.8125 | 0 |
| 0.8131944444444444 | 0 |
| 0.813888888888889 | 0 |
| 0.8145833333333333 | 0 |
| 0.8152777777777778 | 0 |
| 0.8159722222222222 | 0 |
| 0.8166666666666668 | 0 |
| 0.8173611111111111 | 0 |
| 0.8180555555555555 | 0 |
| 0.81875 | 0 |
| 0.8194444444444445 | 0 |
| 0.8201388888888889 | 0 |
| 0.8208333333333333 | 0 |
| 0.8215277777777777 | 0 |
| 0.8222222222222223 | 0 |
| 0.8229166666666666 | 0 |
| 0.8236111111111111 | 0 |
| 0.8243055555555556 | 0 |
| 0.8250000000000001 | 0 |
| 0.8256944444444444 | 0 |
| 0.8263888888888888 | 0 |
| 0.8270833333333334 | 0 |
| 0.8277777777777778 | 0 |
| 0.8284722222222222 | 0 |
| 0.8291666666666666 | 0 |
| 0.8298611111111112 | 0 |
| 0.8305555555555556 | 0 |
| 0.8312499999999999 | 0 |
| 0.8319444444444444 | 0 |
| 0.8326388888888889 | 0 |
| 0.8333333333333334 | 0 |
| 0.8340277777777777 | 0 |
| 0.8347222222222223 | 0 |
| 0.8354166666666667 | 0 |
| 0.8361111111111111 | 0 |
| 0.8368055555555555 | 0 |
| 0.8375 | 0 |
| 0.8381944444444445 | 0 |
| 0.8388888888888889 | 0 |
| 0.8395833333333332 | 0 |
| 0.8402777777777778 | 0 |
| 0.8409722222222222 | 0 |
| 0.8416666666666667 | 0 |
| 0.842361111111111 | 0 |
| 0.8430555555555556 | 0 |
| 0.84375 | 0 |
| 0.8444444444444444 | 0 |
| 0.845138888888889 | 0 |
| 0.8458333333333333 | 0 |
| 0.8465277777777778 | 0 |
| 0.8472222222222222 | 0 |
| 0.8479166666666668 | 0 |
| 0.8486111111111111 | 0 |
| 0.8493055555555555 | 0 |
| 0.85 | 0 |
| 0.8506944444444445 | 0 |
| 0.8513888888888889 | 0 |
| 0.8520833333333333 | 0 |
| 0.8527777777777777 | 0 |
| 0.8534722222222223 | 0 |
| 0.8541666666666666 | 0 |
| 0.8548611111111111 | 0 |
| 0.8555555555555556 | 0 |
| 0.8562500000000001 | 0 |
| 0.8569444444444444 | 0 |
| 0.8576388888888888 | 0 |
| 0.8583333333333334 | 0 |
| 0.8590277777777778 | 0 |
| 0.8597222222222222 | 0 |
| 0.8604166666666666 | 0 |
| 0.8611111111111112 | 0 |
| 0.8618055555555556 | 0 |
| 0.8624999999999999 | 0 |
| 0.8631944444444444 | 0 |
| 0.8638888888888889 | 0 |
| 0.8645833333333334 | 0 |
| 0.8652777777777777 | 0 |
| 0.8659722222222223 | 0 |
| 0.8666666666666667 | 0 |
| 0.8673611111111111 | 0 |
| 0.8680555555555555 | 0 |
| 0.86875 | 0 |
| 0.8694444444444445 | 0 |
| 0.8701388888888889 | 0 |
| 0.8708333333333332 | 0 |
| 0.8715277777777778 | 0 |
| 0.8722222222222222 | 0 |
| 0.8729166666666667 | 0 |
| 0.873611111111111 | 0 |
| 0.8743055555555556 | 0 |
| 0.875 | 0 |
| 0.8756944444444444 | 0 |
| 0.876388888888889 | 0 |
| 0.8770833333333333 | 0 |
| 0.8777777777777778 | 0 |
| 0.8784722222222222 | 0 |
| 0.8791666666666668 | 0 |
| 0.8798611111111111 | 0 |
| 0.8805555555555555 | 0 |
| 0.88125 | 0 |
| 0.8819444444444445 | 0 |
| 0.8826388888888889 | 0 |
| 0.8833333333333333 | 0 |
| 0.8840277777777777 | 0 |
| 0.8847222222222223 | 0 |
| 0.8854166666666666 | 0 |
| 0.8861111111111111 | 0 |
| 0.8868055555555556 | 0 |
| 0.8875000000000001 | 0 |
| 0.8881944444444444 | 0 |
| 0.8888888888888888 | 0 |
| 0.8895833333333334 | 0 |
| 0.8902777777777778 | 0 |
| 0.8909722222222222 | 0 |
| 0.8916666666666666 | 0 |
| 0.8923611111111112 | 0 |
| 0.8930555555555556 | 0 |
| 0.8937499999999999 | 0 |
| 0.8944444444444444 | 0 |
| 0.8951388888888889 | 0 |
| 0.8958333333333334 | 0 |
| 0.8965277777777777 | 0 |
| 0.8972222222222223 | 0 |
| 0.8979166666666667 | 0 |
| 0.8986111111111111 | 0 |
| 0.8993055555555555 | 0 |
| 0.9 | 0 |
| 0.9006944444444445 | 0 |
| 0.9013888888888889 | 0 |
| 0.9020833333333332 | 0 |
| 0.9027777777777778 | 0 |
| 0.9034722222222222 | 0 |
| 0.9041666666666667 | 0 |
| 0.904861111111111 | 0 |
| 0.9055555555555556 | 0 |
| 0.90625 | 0 |
| 0.9069444444444444 | 0 |
| 0.907638888888889 | 0 |
| 0.9083333333333333 | 0 |
| 0.9090277777777778 | 0 |
| 0.9097222222222222 | 0 |
| 0.9104166666666668 | 0 |
| 0.9111111111111111 | 0 |
| 0.9118055555555555 | 0 |
| 0.9125 | 0 |
| 0.9131944444444445 | 0 |
| 0.9138888888888889 | 0 |
| 0.9145833333333333 | 0 |
| 0.9152777777777777 | 0 |
| 0.9159722222222223 | 0 |
| 0.9166666666666666 | 0 |
| 0.9173611111111111 | 0 |
| 0.9180555555555556 | 0 |
| 0.9187500000000001 | 0 |
| 0.9194444444444444 | 0 |
| 0.9201388888888888 | 0 |
| 0.9208333333333334 | 0 |
| 0.9215277777777778 | 0 |
| 0.9222222222222222 | 0 |
| 0.9229166666666666 | 0 |
| 0.9236111111111112 | 0 |
| 0.9243055555555556 | 0 |
| 0.9249999999999999 | 0 |
| 0.9256944444444444 | 0 |
| 0.9263888888888889 | 0 |
| 0.9270833333333334 | 0 |
| 0.9277777777777777 | 0 |
| 0.9284722222222223 | 0 |
| 0.9291666666666667 | 0 |
| 0.9298611111111111 | 0 |
| 0.9305555555555555 | 0 |
| 0.93125 | 0 |
| 0.9319444444444445 | 0 |
| 0.9326388888888889 | 0 |
| 0.9333333333333332 | 0 |
| 0.9340277777777778 | 0 |
| 0.9347222222222222 | 0 |
| 0.9354166666666667 | 0 |
| 0.936111111111111 | 0 |
| 0.9368055555555556 | 0 |
| 0.9375 | 0 |
| 0.9381944444444444 | 0 |
| 0.938888888888889 | 0 |
| 0.9395833333333333 | 0 |
| 0.9402777777777778 | 0 |
| 0.9409722222222222 | 0 |
| 0.9416666666666668 | 0 |
| 0.9423611111111111 | 0 |
| 0.9430555555555555 | 0 |
| 0.94375 | 0 |
| 0.9444444444444445 | 0 |
| 0.9451388888888889 | 0 |
| 0.9458333333333333 | 0 |
| 0.9465277777777777 | 0 |
| 0.9472222222222223 | 0 |
| 0.9479166666666666 | 0 |
| 0.9486111111111111 | 0 |
| 0.9493055555555556 | 0 |
| 0.9500000000000001 | 0 |
| 0.9506944444444444 | 0 |
| 0.9513888888888888 | 0 |
| 0.9520833333333334 | 0 |
| 0.9527777777777778 | 0 |
| 0.9534722222222222 | 0 |
| 0.9541666666666666 | 0 |
| 0.9548611111111112 | 0 |
| 0.9555555555555556 | 0 |
| 0.9562499999999999 | 0 |
| 0.9569444444444444 | 0 |
| 0.9576388888888889 | 0 |
| 0.9583333333333334 | 0 |
| 0.9590277777777777 | 0 |
| 0.9597222222222223 | 0 |
| 0.9604166666666667 | 0 |
| 0.9611111111111111 | 0 |
| 0.9618055555555555 | 0 |
| 0.9625 | 0 |
| 0.9631944444444445 | 0 |
| 0.9638888888888889 | 0 |
| 0.9645833333333332 | 0 |
| 0.9652777777777778 | 0 |
| 0.9659722222222222 | 0 |
| 0.9666666666666667 | 0 |
| 0.967361111111111 | 0 |
| 0.9680555555555556 | 0 |
| 0.96875 | 0 |
| 0.9694444444444444 | 0 |
| 0.970138888888889 | 0 |
| 0.9708333333333333 | 0 |
| 0.9715277777777778 | 0 |
| 0.9722222222222222 | 0 |
| 0.9729166666666668 | 0 |
| 0.9736111111111111 | 0 |
| 0.9743055555555555 | 0 |
| 0.975 | 0 |
| 0.9756944444444445 | 0 |
| 0.9763888888888889 | 0 |
| 0.9770833333333333 | 0 |
| 0.9777777777777777 | 0 |
| 0.9784722222222223 | 0 |
| 0.9791666666666666 | 0 |
| 0.9798611111111111 | 0 |
| 0.9805555555555556 | 0 |
| 0.9812500000000001 | 0 |
| 0.9819444444444444 | 0 |
| 0.9826388888888888 | 0 |
| 0.9833333333333334 | 0 |
| 0.9840277777777778 | 0 |
| 0.9847222222222222 | 0 |
| 0.9854166666666666 | 0 |
| 0.9861111111111112 | 0 |
| 0.9868055555555556 | 0 |
| 0.9874999999999999 | 0 |
| 0.9881944444444444 | 0 |
| 0.9888888888888889 | 0 |
| 0.9895833333333334 | 0 |
| 0.9902777777777777 | 0 |
| 0.9909722222222223 | 0 |
| 0.9916666666666667 | 0 |
| 0.9923611111111111 | 0 |
| 0.9930555555555555 | 0 |
| 0.99375 | 0 |
| 0.9944444444444445 | 0 |
| 0.9951388888888889 | 0 |
| 0.9958333333333332 | 0 |
| 0.9965277777777778 | 0 |
| 0.9972222222222222 | 0 |
| 0.9979166666666667 | 0 |
| 0.998611111111111 | 0 |
| 0.9993055555555556 | 0 |